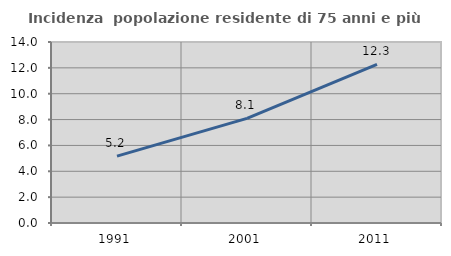
| Category | Incidenza  popolazione residente di 75 anni e più |
|---|---|
| 1991.0 | 5.175 |
| 2001.0 | 8.091 |
| 2011.0 | 12.262 |